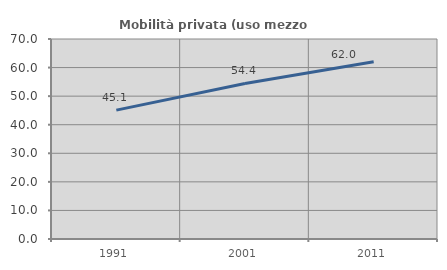
| Category | Mobilità privata (uso mezzo privato) |
|---|---|
| 1991.0 | 45.109 |
| 2001.0 | 54.443 |
| 2011.0 | 62.023 |